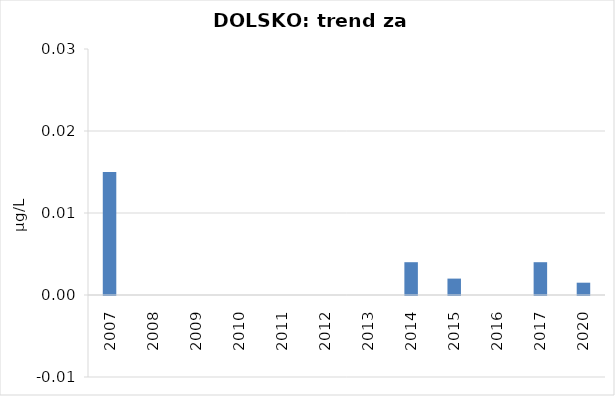
| Category | Vsota |
|---|---|
| 2007 | 0.015 |
| 2008 | 0 |
| 2009 | 0 |
| 2010 | 0 |
| 2011 | 0 |
| 2012 | 0 |
| 2013 | 0 |
| 2014 | 0.004 |
| 2015 | 0.002 |
| 2016 | 0 |
| 2017 | 0.004 |
| 2020 | 0.002 |